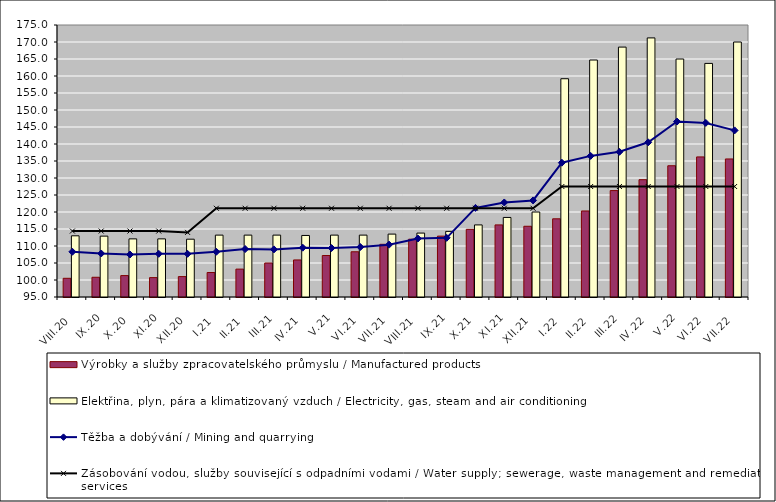
| Category | Výrobky a služby zpracovatelského průmyslu / Manufactured products | Elektřina, plyn, pára a klimatizovaný vzduch / Electricity, gas, steam and air conditioning |
|---|---|---|
| VIII.20 | 100.5 | 113 |
| IX.20 | 100.8 | 112.9 |
| X.20 | 101.3 | 112.1 |
| XI.20 | 100.7 | 112.1 |
| XII.20 | 101 | 112 |
| I.21 | 102.2 | 113.2 |
| II.21 | 103.2 | 113.2 |
| III.21 | 105 | 113.2 |
| IV.21 | 105.9 | 113.1 |
| V.21 | 107.2 | 113.2 |
| VI.21 | 108.3 | 113.2 |
| VII.21 | 110.5 | 113.5 |
| VIII.21 | 112 | 113.8 |
| IX.21 | 112.9 | 114.3 |
| X.21 | 114.9 | 116.2 |
| XI.21 | 116.2 | 118.4 |
| XII.21 | 115.8 | 120 |
| I.22 | 118 | 159.2 |
| II.22 | 120.3 | 164.7 |
| III.22 | 126.3 | 168.5 |
| IV.22 | 129.5 | 171.2 |
| V.22 | 133.6 | 165 |
| VI.22 | 136.2 | 163.7 |
| VII.22 | 135.6 | 170 |